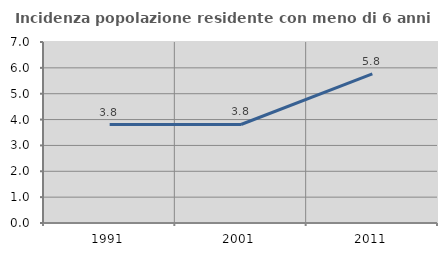
| Category | Incidenza popolazione residente con meno di 6 anni |
|---|---|
| 1991.0 | 3.808 |
| 2001.0 | 3.81 |
| 2011.0 | 5.769 |